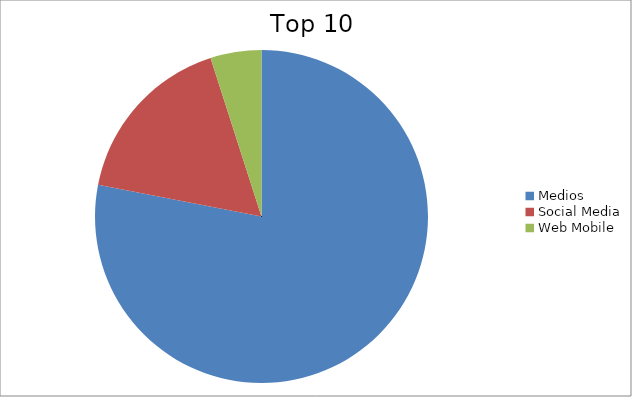
| Category | Series 0 |
|---|---|
| Medios | 78.07 |
| Social Media | 16.99 |
| Web Mobile | 4.95 |